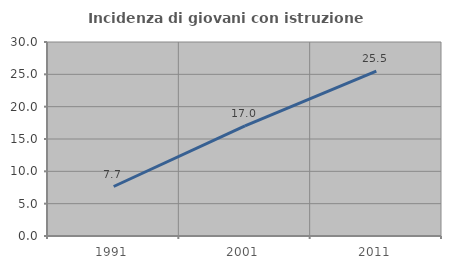
| Category | Incidenza di giovani con istruzione universitaria |
|---|---|
| 1991.0 | 7.653 |
| 2001.0 | 17.033 |
| 2011.0 | 25.49 |